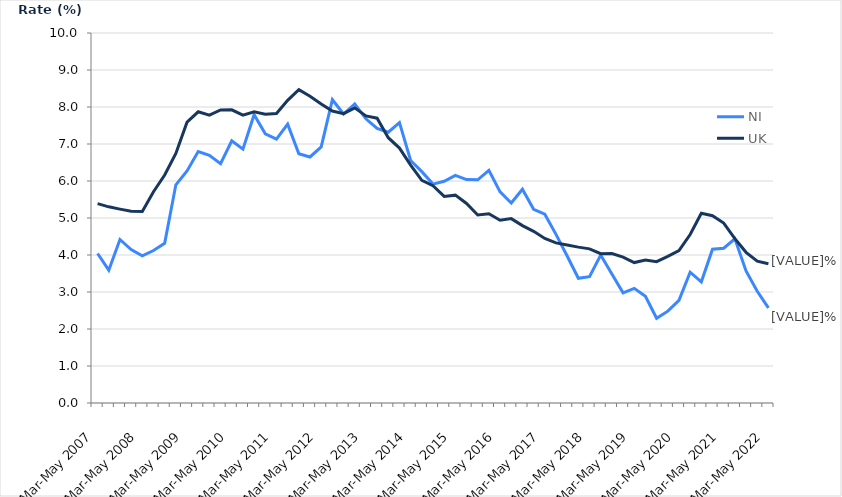
| Category | NI | UK |
|---|---|---|
| Mar-May 2007 | 4.04 | 5.389 |
| Jun-Aug 2007 | 3.589 | 5.302 |
| Sep-Nov 2007 | 4.419 | 5.239 |
| Dec-Feb 2008 | 4.146 | 5.181 |
| Mar-May 2008 | 3.979 | 5.179 |
| Jun-Aug 2008 | 4.122 | 5.71 |
| Sep-Nov 2008 | 4.317 | 6.163 |
| Dec-Feb 2009 | 5.897 | 6.744 |
| Mar-May 2009 | 6.27 | 7.59 |
| Jun-Aug 2009 | 6.796 | 7.87 |
| Sep-Nov 2009 | 6.693 | 7.781 |
| Dec-Feb 2010 | 6.47 | 7.92 |
| Mar-May 2010 | 7.085 | 7.923 |
| Jun-Aug 2010 | 6.862 | 7.782 |
| Sep-Nov 2010 | 7.791 | 7.871 |
| Dec-Feb 2011 | 7.277 | 7.803 |
| Mar-May 2011 | 7.133 | 7.822 |
| Jun-Aug 2011 | 7.538 | 8.181 |
| Sep-Nov 2011 | 6.736 | 8.467 |
| Dec-Feb 2012 | 6.65 | 8.289 |
| Mar-May 2012 | 6.922 | 8.08 |
| Jun-Aug 2012 | 8.196 | 7.89 |
| Sep-Nov 2012 | 7.81 | 7.82 |
| Dec-Feb 2013 | 8.083 | 7.976 |
| Mar-May 2013 | 7.68 | 7.758 |
| Jun-Aug 2013 | 7.422 | 7.698 |
| Sep-Nov 2013 | 7.318 | 7.17 |
| Dec-Feb 2014 | 7.578 | 6.889 |
| Mar-May 2014 | 6.554 | 6.428 |
| Jun-Aug 2014 | 6.253 | 6.019 |
| Sep-Nov 2014 | 5.916 | 5.871 |
| Dec-Feb 2015 | 5.991 | 5.583 |
| Mar-May 2015 | 6.154 | 5.617 |
| Jun-Aug 2015 | 6.039 | 5.392 |
| Sep-Nov 2015 | 6.033 | 5.081 |
| Dec-Feb 2016 | 6.288 | 5.113 |
| Mar-May 2016 | 5.706 | 4.939 |
| Jun-Aug 2016 | 5.404 | 4.983 |
| Sep-Nov 2016 | 5.778 | 4.794 |
| Dec-Feb 2017 | 5.235 | 4.64 |
| Mar-May 2017 | 5.102 | 4.445 |
| Jun-Aug 2017 | 4.558 | 4.328 |
| Sep-Nov 2017 | 3.974 | 4.272 |
| Dec-Feb 2018 | 3.371 | 4.213 |
| Mar-May 2018 | 3.416 | 4.165 |
| Jun-Aug 2018 | 3.999 | 4.035 |
| Sep-Nov 2018 | 3.486 | 4.039 |
| Dec-Feb 2019 | 2.979 | 3.942 |
| Mar-May 2019 | 3.099 | 3.796 |
| Jun-Aug 2019 | 2.886 | 3.863 |
| Sep-Nov 2019 | 2.289 | 3.819 |
| Dec-Feb 2020 | 2.483 | 3.961 |
| Mar-May 2020 | 2.775 | 4.118 |
| Jun-Aug 2020 | 3.535 | 4.554 |
| Sep-Nov 2020 | 3.274 | 5.129 |
| Dec-Feb 2021 | 4.156 | 5.063 |
| Mar-May 2021 | 4.183 | 4.862 |
| Jun-Aug 2021 | 4.437 | 4.444 |
| Sep-Nov 2021 | 3.571 | 4.073 |
| Dec-Feb 2022 | 3.018 | 3.832 |
| Mar-May 2022 | 2.569 | 3.764 |